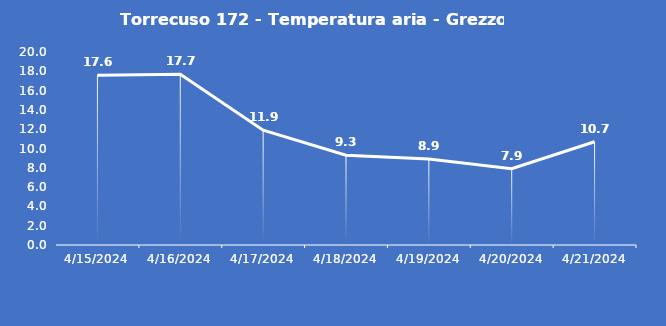
| Category | Torrecuso 172 - Temperatura aria - Grezzo (°C) |
|---|---|
| 4/15/24 | 17.6 |
| 4/16/24 | 17.7 |
| 4/17/24 | 11.9 |
| 4/18/24 | 9.3 |
| 4/19/24 | 8.9 |
| 4/20/24 | 7.9 |
| 4/21/24 | 10.7 |